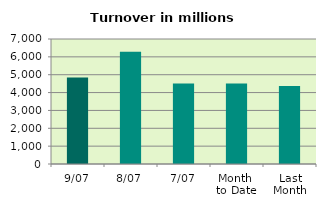
| Category | Series 0 |
|---|---|
| 9/07 | 4842.244 |
| 8/07 | 6286.475 |
| 7/07 | 4508.682 |
| Month 
to Date | 4513.617 |
| Last
Month | 4366.67 |